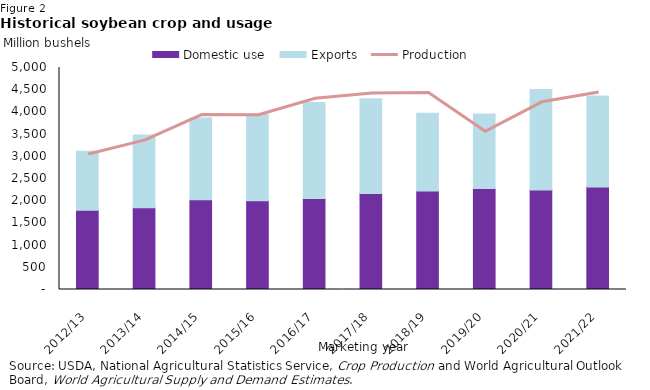
| Category | Domestic use | Exports |
|---|---|---|
| 2012/13 | 1783.847 | 1327.526 |
| 2013/14 | 1838.788 | 1638.56 |
| 2014/15 | 2020.5 | 1842.175 |
| 2015/16 | 2001.594 | 1942.606 |
| 2016/17 | 2047.36 | 2166.551 |
| 2017/18 | 2163.203 | 2133.731 |
| 2018/19 | 2217.83 | 1753.43 |
| 2019/20 | 2272.562 | 1679.237 |
| 2020/21 | 2238.271 | 2265.431 |
| 2021/22 | 2307.268 | 2050 |